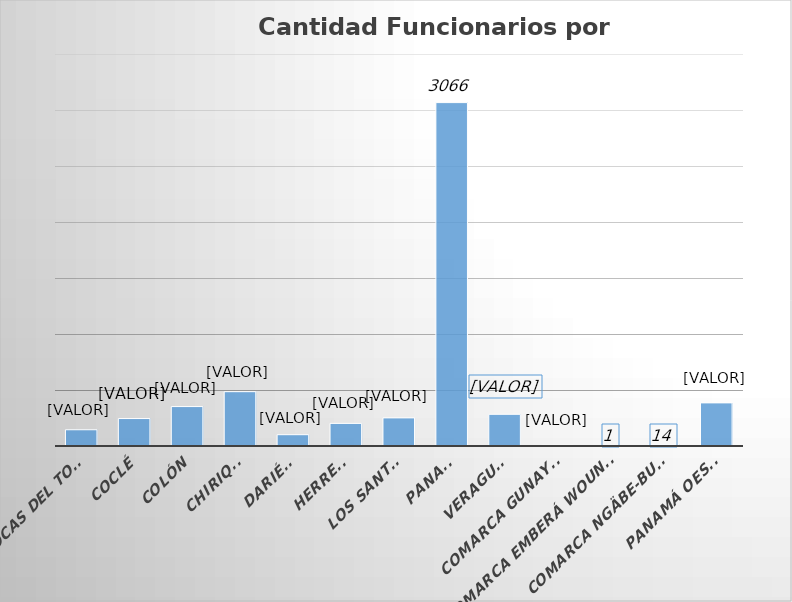
| Category | Cantidad  |
|---|---|
| BOCAS DEL TORO | 145 |
| COCLÉ | 245 |
| COLÓN | 352 |
| CHIRIQUÍ | 485 |
| DARIÉN | 101 |
| HERRERA | 202 |
| LOS SANTOS | 251 |
| PANAMÁ | 3066 |
| VERAGUAS | 283 |
| COMARCA GUNAYALA | 7 |
| COMARCA EMBERÁ WOUNAAN | 1 |
| COMARCA NGÄBE-BUGLÉ | 14 |
| PANAMÁ OESTE | 385 |